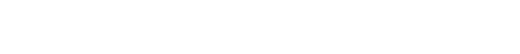
| Category | oui | non |
|---|---|---|
| 0 | 0 | 0 |